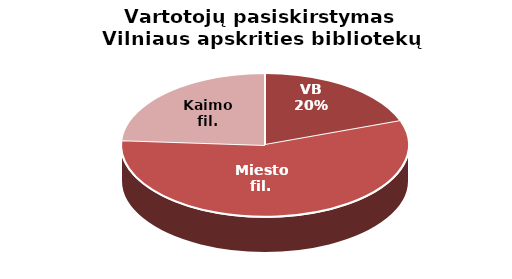
| Category | Series 0 |
|---|---|
| VB | 18727 |
| Miesto fil. | 53875 |
| Kaimo fil. | 22868 |